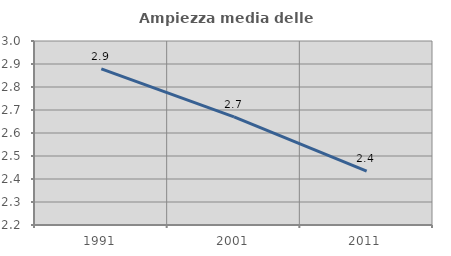
| Category | Ampiezza media delle famiglie |
|---|---|
| 1991.0 | 2.878 |
| 2001.0 | 2.67 |
| 2011.0 | 2.434 |